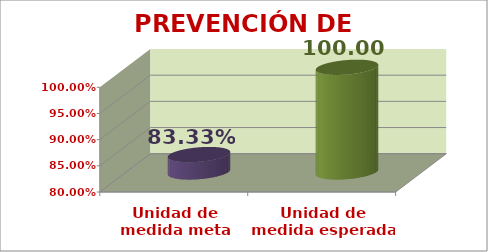
| Category | PREVENCIÓN DE RIESGOS |
|---|---|
| Unidad de medida meta base | 0.833 |
| Unidad de medida esperada | 1 |